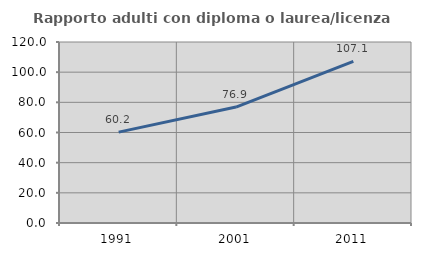
| Category | Rapporto adulti con diploma o laurea/licenza media  |
|---|---|
| 1991.0 | 60.227 |
| 2001.0 | 76.86 |
| 2011.0 | 107.143 |